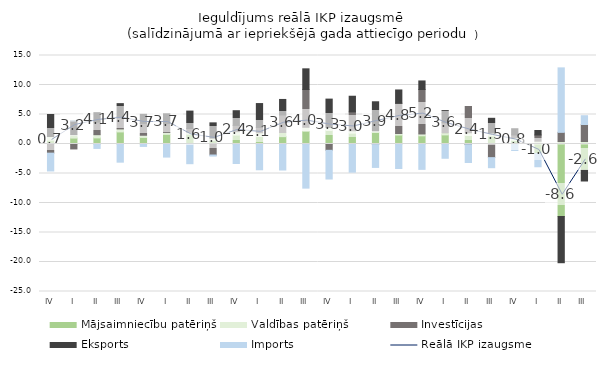
| Category | Mājsaimniecību patēriņš | Valdības patēriņš | Investīcijas | Eksports | Imports |
|---|---|---|---|---|---|
| IV | 0.641 | 0.624 | -1.55 | 3.739 | -3.021 |
| I | 1.004 | 0.583 | -0.838 | 2.321 | 0.014 |
| II | 1.038 | 0.541 | 2.13 | 1.604 | -0.752 |
| III | 2.048 | 0.508 | 2.091 | 2.195 | -3.08 |
| IV | 1.116 | 0.367 | 2.006 | 1.544 | -0.414 |
| I | 1.633 | 0.335 | 1.497 | 1.661 | -2.217 |
| II | 1.645 | 0.328 | 0.652 | 2.952 | -3.338 |
| III | 0.612 | 0.396 | -1.866 | 2.575 | -0.182 |
| IV | 1.515 | 0.578 | 1.059 | 2.49 | -3.304 |
| I | 1.275 | 0.629 | 0.902 | 4.048 | -4.367 |
| II | 1.246 | 0.703 | 2.977 | 2.626 | -4.409 |
| III | 2.162 | 0.67 | 6.406 | 3.503 | -7.48 |
| IV | 2.292 | 0.522 | -1.069 | 4.796 | -4.866 |
| I | 1.834 | 0.409 | 3.202 | 2.65 | -4.77 |
| II | 1.947 | 0.296 | -0.095 | 4.914 | -3.875 |
| III | 1.52 | 0.258 | 5.133 | 2.247 | -4.153 |
| IV | 1.39 | 0.311 | 7.531 | 1.454 | -4.298 |
| I | 1.545 | 0.387 | 1.657 | 2.074 | -2.419 |
| II | 1.44 | 0.464 | 4.455 | -0.106 | -3.034 |
| III | 1.355 | 0.501 | -2.31 | 2.499 | -1.705 |
| IV | 0.59 | 0.488 | 0.458 | 1.054 | -1.105 |
| I | -1.616 | 0.475 | 1.055 | 0.759 | -2.242 |
| II | -12.29 | 0.427 | 1.547 | -7.831 | 10.928 |
| III | -4.456 | 0.419 | 2.881 | -1.814 | 1.494 |